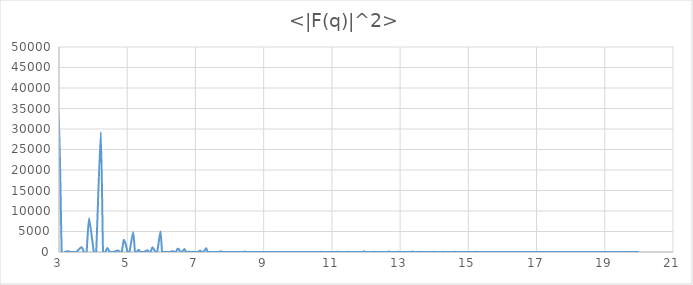
| Category | <|F(q)|^2> |
|---|---|
| 0.0 | 287296.001 |
| 0.746842 | 0 |
| 1.056195 | 0 |
| 1.293569 | 7127.229 |
| 1.493685 | 0.997 |
| 1.66999 | 0 |
| 1.829383 | 0 |
| 2.112389 | 4289.775 |
| 2.240527 | 0 |
| 2.361723 | 0 |
| 2.476996 | 12698.126 |
| 2.587138 | 2357.81 |
| 2.692779 | 0 |
| 2.794428 | 0 |
| 2.98737 | 35082.252 |
| 3.07931 | 0 |
| 3.168584 | 0 |
| 3.255411 | 201.297 |
| 3.339981 | 1.784 |
| 3.422462 | 0 |
| 3.503001 | 0 |
| 3.658766 | 1182.676 |
| 3.734212 | 0 |
| 3.808164 | 0 |
| 3.880707 | 8228.632 |
| 4.021869 | 0 |
| 4.090624 | 0 |
| 4.224779 | 29259.504 |
| 4.290283 | 0 |
| 4.354802 | 0 |
| 4.418379 | 999.587 |
| 4.481054 | 59.221 |
| 4.542865 | 0 |
| 4.603846 | 0 |
| 4.723446 | 388.815 |
| 4.782125 | 0 |
| 4.840092 | 0 |
| 4.897373 | 2905.064 |
| 4.953992 | 1963.209 |
| 5.009971 | 0 |
| 5.065332 | 0 |
| 5.174276 | 4849.136 |
| 5.227897 | 0 |
| 5.280973 | 0 |
| 5.333522 | 540.499 |
| 5.385557 | 6.911 |
| 5.437095 | 0 |
| 5.488148 | 0 |
| 5.588857 | 426.93 |
| 5.638537 | 0 |
| 5.687782 | 0 |
| 5.736605 | 1158.048 |
| 5.833026 | 0 |
| 5.880643 | 0 |
| 5.974739 | 5047.953 |
| 6.021236 | 0 |
| 6.067376 | 0 |
| 6.113169 | 10.966 |
| 6.15862 | 6.677 |
| 6.203739 | 0 |
| 6.248532 | 0 |
| 6.337168 | 218.027 |
| 6.381024 | 0 |
| 6.424581 | 0 |
| 6.467845 | 690.596 |
| 6.510821 | 722.292 |
| 6.553516 | 0 |
| 6.595934 | 0 |
| 6.679962 | 741.55 |
| 6.721582 | 0 |
| 6.762946 | 0 |
| 6.804058 | 71.332 |
| 6.844924 | 11.957 |
| 6.885547 | 0 |
| 6.925932 | 0 |
| 7.006003 | 26.612 |
| 7.045697 | 0 |
| 7.085169 | 0 |
| 7.124423 | 335.788 |
| 7.202287 | 0 |
| 7.240906 | 0 |
| 7.317531 | 959.275 |
| 7.355545 | 0 |
| 7.393363 | 0 |
| 7.430988 | 24.122 |
| 7.468424 | 1.107 |
| 7.505673 | 0 |
| 7.542739 | 0 |
| 7.616328 | 30.217 |
| 7.652857 | 0 |
| 7.689213 | 0 |
| 7.725398 | 134.426 |
| 7.761414 | 100.033 |
| 7.797264 | 0 |
| 7.832949 | 0 |
| 7.939044 | 0 |
| 7.974095 | 0 |
| 8.008993 | 16.462 |
| 8.043739 | 0.978 |
| 8.078336 | 0 |
| 8.112785 | 0 |
| 8.181249 | 7.086 |
| 8.215267 | 0 |
| 8.249144 | 0 |
| 8.282883 | 25.98 |
| 8.349952 | 0 |
| 8.383285 | 0 |
| 8.449557 | 99.817 |
| 8.482499 | 0 |
| 8.515314 | 0 |
| 8.548002 | 3.303 |
| 8.580566 | 0.495 |
| 8.613007 | 0 |
| 8.645326 | 0 |
| 8.709604 | 1.879 |
| 8.741566 | 0 |
| 8.773412 | 0 |
| 8.805142 | 6.072 |
| 8.836759 | 5.076 |
| 8.868262 | 0 |
| 8.899654 | 0 |
| 8.962109 | 8.65 |
| 8.993174 | 0 |
| 9.024131 | 0 |
| 9.054983 | 0.429 |
| 9.08573 | 0.003 |
| 9.116373 | 0 |
| 9.146914 | 0 |
| 9.207692 | 0.102 |
| 9.23793 | 0 |
| 9.268071 | 0 |
| 9.298113 | 0.193 |
| 9.357909 | 0 |
| 9.387664 | 0 |
| 9.446892 | 13.176 |
| 9.476368 | 0 |
| 9.505752 | 0 |
| 9.535046 | 0.169 |
| 9.56425 | 0.022 |
| 9.593365 | 0 |
| 9.622391 | 0 |
| 9.680184 | 0.681 |
| 9.708951 | 0 |
| 9.737634 | 0 |
| 9.766232 | 6.063 |
| 9.794746 | 1.783 |
| 9.823178 | 0 |
| 9.851528 | 0 |
| 9.907984 | 13.92 |
| 9.936092 | 0 |
| 9.964121 | 0 |
| 9.99207 | 4.409 |
| 10.019942 | 0.096 |
| 10.047737 | 0 |
| 10.075455 | 0 |
| 10.130663 | 2.152 |
| 10.158155 | 0 |
| 10.185573 | 0 |
| 10.212916 | 19.161 |
| 10.267386 | 0 |
| 10.294512 | 0 |
| 10.348552 | 25.741 |
| 10.375466 | 0 |
| 10.402311 | 0 |
| 10.429087 | 5.575 |
| 10.455794 | 0.449 |
| 10.482433 | 0 |
| 10.509004 | 0 |
| 10.561947 | 3.25 |
| 10.588319 | 0 |
| 10.614625 | 0 |
| 10.640866 | 22.802 |
| 10.667043 | 55.324 |
| 10.693156 | 0 |
| 10.719205 | 0 |
| 10.771114 | 19.37 |
| 10.796976 | 0 |
| 10.822775 | 0 |
| 10.848513 | 0.894 |
| 10.87419 | 1.37 |
| 10.899806 | 0 |
| 10.925363 | 0 |
| 10.976297 | 4.587 |
| 11.001676 | 0 |
| 11.026996 | 0 |
| 11.052258 | 29.786 |
| 11.102611 | 0 |
| 11.127701 | 0 |
| 11.177714 | 81.285 |
| 11.202636 | 0 |
| 11.227503 | 0 |
| 11.252316 | 4.654 |
| 11.277073 | 0.984 |
| 11.301777 | 0 |
| 11.326426 | 0 |
| 11.375565 | 13.295 |
| 11.400055 | 0 |
| 11.424492 | 0 |
| 11.448877 | 36.912 |
| 11.473211 | 57.323 |
| 11.497493 | 0 |
| 11.521724 | 0 |
| 11.594112 | 0 |
| 11.618141 | 0 |
| 11.642121 | 3.925 |
| 11.666051 | 1.177 |
| 11.689933 | 0 |
| 11.713766 | 0 |
| 11.761286 | 4.782 |
| 11.784975 | 0 |
| 11.808615 | 0 |
| 11.832209 | 31.227 |
| 11.879256 | 0 |
| 11.902709 | 0 |
| 11.949479 | 181.607 |
| 11.972795 | 0 |
| 11.996065 | 0 |
| 12.019291 | 4.482 |
| 12.042472 | 0.741 |
| 12.065608 | 0 |
| 12.088701 | 0 |
| 12.134753 | 9.42 |
| 12.157714 | 0 |
| 12.180631 | 0 |
| 12.203506 | 31.783 |
| 12.226337 | 56.857 |
| 12.249126 | 0 |
| 12.271873 | 0 |
| 12.317241 | 33.372 |
| 12.339862 | 0 |
| 12.362442 | 0 |
| 12.38498 | 4.846 |
| 12.407478 | 0.904 |
| 12.429935 | 0 |
| 12.452352 | 0 |
| 12.497064 | 10.83 |
| 12.51936 | 0 |
| 12.541617 | 0 |
| 12.563834 | 25.943 |
| 12.608151 | 0 |
| 12.630251 | 0 |
| 12.674336 | 126.874 |
| 12.696321 | 0 |
| 12.718268 | 0 |
| 12.740177 | 7.005 |
| 12.762049 | 1.714 |
| 12.783883 | 0 |
| 12.80568 | 0 |
| 12.849163 | 9.377 |
| 12.870849 | 0 |
| 12.892499 | 0 |
| 12.914113 | 38.525 |
| 12.93569 | 46.37 |
| 12.957232 | 0 |
| 12.978737 | 0 |
| 13.021642 | 13.272 |
| 13.043042 | 0 |
| 13.064407 | 0 |
| 13.085736 | 6.803 |
| 13.107031 | 0.776 |
| 13.128292 | 0 |
| 13.149518 | 0 |
| 13.191867 | 20.081 |
| 13.212991 | 0 |
| 13.234081 | 0 |
| 13.255138 | 35.133 |
| 13.297151 | 0 |
| 13.318108 | 0 |
| 13.359923 | 110.589 |
| 13.380782 | 0 |
| 13.401608 | 0 |
| 13.422402 | 6.084 |
| 13.443163 | 1.613 |
| 13.463893 | 0 |
| 13.484591 | 0 |
| 13.525891 | 8.015 |
| 13.546494 | 0 |
| 13.567066 | 0 |
| 13.587607 | 23.995 |
| 13.608116 | 60.746 |
| 13.628595 | 0 |
| 13.649043 | 0 |
| 13.689848 | 19.576 |
| 13.710204 | 0 |
| 13.730531 | 0 |
| 13.750827 | 5.98 |
| 13.771094 | 2.074 |
| 13.79133 | 0 |
| 13.811538 | 0 |
| 13.851863 | 6.132 |
| 13.871982 | 0 |
| 13.892072 | 0 |
| 13.912133 | 32.184 |
| 13.952168 | 0 |
| 13.972142 | 0 |
| 14.012006 | 60.528 |
| 14.031895 | 0 |
| 14.051756 | 0 |
| 14.071589 | 1.226 |
| 14.091394 | 1.216 |
| 14.111172 | 0 |
| 14.130922 | 0 |
| 14.170338 | 4.115 |
| 14.190006 | 0 |
| 14.209646 | 0 |
| 14.229259 | 28.622 |
| 14.248845 | 72.874 |
| 14.268404 | 0 |
| 14.287937 | 0 |
| 14.346374 | 0 |
| 14.365801 | 0 |
| 14.385201 | 3.221 |
| 14.404575 | 0.691 |
| 14.423923 | 0 |
| 14.443245 | 0 |
| 14.481812 | 7.782 |
| 14.501057 | 0 |
| 14.520276 | 0 |
| 14.53947 | 26.984 |
| 14.577782 | 0 |
| 14.596901 | 0 |
| 14.635063 | 59.019 |
| 14.654106 | 0 |
| 14.673125 | 0 |
| 14.69212 | 2.074 |
| 14.711089 | 1.222 |
| 14.730035 | 0 |
| 14.748956 | 0 |
| 14.786725 | 7.46 |
| 14.805574 | 0 |
| 14.824399 | 0 |
| 14.843199 | 19.168 |
| 14.861976 | 29.519 |
| 14.88073 | 0 |
| 14.899459 | 0 |
| 14.936848 | 13.718 |
| 14.955508 | 0 |
| 14.974144 | 0 |
| 14.992757 | 0.747 |
| 15.011347 | 1.069 |
| 15.029914 | 0 |
| 15.048458 | 0 |
| 15.085477 | 3.344 |
| 15.103953 | 0 |
| 15.122406 | 0 |
| 15.140837 | 19.558 |
| 15.177631 | 0 |
| 15.195995 | 0 |
| 15.232656 | 57.544 |
| 15.250954 | 0 |
| 15.269229 | 0 |
| 15.287483 | 1.648 |
| 15.305715 | 0.369 |
| 15.323925 | 0 |
| 15.342114 | 0 |
| 15.378427 | 5.178 |
| 15.396551 | 0 |
| 15.414654 | 0 |
| 15.432735 | 14.309 |
| 15.450796 | 25.792 |
| 15.468835 | 0 |
| 15.486854 | 0 |
| 15.522828 | 14.26 |
| 15.540784 | 0 |
| 15.558719 | 0 |
| 15.576634 | 1.452 |
| 15.594527 | 0.802 |
| 15.612401 | 0 |
| 15.630254 | 0 |
| 15.665899 | 3.663 |
| 15.683691 | 0 |
| 15.701463 | 0 |
| 15.719214 | 15.421 |
| 15.754658 | 0 |
| 15.77235 | 0 |
| 15.825307 | 0 |
| 15.84292 | 0 |
| 15.860514 | 3.698 |
| 15.878088 | 0.526 |
| 15.895642 | 0 |
| 15.913177 | 0 |
| 15.94819 | 4.813 |
| 15.965667 | 0 |
| 15.983126 | 0 |
| 16.000565 | 13.528 |
| 16.017985 | 18.871 |
| 16.035387 | 0 |
| 16.052769 | 0 |
| 16.087478 | 4.991 |
| 16.104804 | 0 |
| 16.122112 | 0 |
| 16.139401 | 1.838 |
| 16.156672 | 0.523 |
| 16.173924 | 0 |
| 16.191158 | 0 |
| 16.22557 | 3.241 |
| 16.242749 | 0 |
| 16.25991 | 0 |
| 16.277053 | 11.411 |
| 16.311285 | 0 |
| 16.328373 | 0 |
| 16.362497 | 36.234 |
| 16.379533 | 0 |
| 16.396551 | 0 |
| 16.413551 | 1.303 |
| 16.430533 | 0.625 |
| 16.447498 | 0 |
| 16.464445 | 0 |
| 16.498288 | 3.578 |
| 16.515183 | 0 |
| 16.532062 | 0 |
| 16.548922 | 10.951 |
| 16.565766 | 26.908 |
| 16.582593 | 0 |
| 16.599402 | 0 |
| 16.649729 | 0 |
| 16.666471 | 0 |
| 16.683196 | 3.148 |
| 16.699904 | 0.604 |
| 16.716596 | 0 |
| 16.733271 | 0 |
| 16.766571 | 2.757 |
| 16.783196 | 0 |
| 16.799805 | 0 |
| 16.816397 | 6.857 |
| 16.849533 | 0 |
| 16.866076 | 0 |
| 16.899115 | 20.087 |
| 16.91561 | 0 |
| 16.932089 | 0 |
| 16.948552 | 0.854 |
| 16.964998 | 0.582 |
| 16.981429 | 0 |
| 16.997845 | 0 |
| 17.030627 | 1.624 |
| 17.046995 | 0 |
| 17.063347 | 0 |
| 17.079683 | 7.084 |
| 17.096004 | 16.465 |
| 17.112309 | 0 |
| 17.128599 | 0 |
| 17.161132 | 2.268 |
| 17.177376 | 0 |
| 17.193604 | 0 |
| 17.209816 | 0.687 |
| 17.226014 | 0.363 |
| 17.242196 | 0 |
| 17.258363 | 0 |
| 17.290652 | 2.147 |
| 17.306774 | 0 |
| 17.322881 | 0 |
| 17.338972 | 6.68 |
| 17.371111 | 0 |
| 17.387159 | 0 |
| 17.419209 | 13.302 |
| 17.435212 | 0 |
| 17.4512 | 0 |
| 17.467174 | 1.932 |
| 17.483133 | 0.651 |
| 17.499077 | 0 |
| 17.515007 | 0 |
| 17.546824 | 1.437 |
| 17.56271 | 0 |
| 17.578583 | 0 |
| 17.594441 | 4.198 |
| 17.610284 | 8.95 |
| 17.626114 | 0 |
| 17.641929 | 0 |
| 17.673517 | 2.02 |
| 17.68929 | 0 |
| 17.705049 | 0 |
| 17.720794 | 0.777 |
| 17.736525 | 0.493 |
| 17.752242 | 0 |
| 17.767945 | 0 |
| 17.799309 | 0.797 |
| 17.81497 | 0 |
| 17.830618 | 0 |
| 17.846252 | 4.771 |
| 17.877479 | 0 |
| 17.893072 | 0 |
| 17.924218 | 10.346 |
| 17.93977 | 0 |
| 17.955309 | 0 |
| 17.970835 | 0.618 |
| 17.986347 | 0.218 |
| 18.001846 | 0 |
| 18.017331 | 0 |
| 18.048262 | 0.891 |
| 18.063708 | 0 |
| 18.079141 | 0 |
| 18.09456 | 4.469 |
| 18.109966 | 9.207 |
| 18.125359 | 0 |
| 18.140739 | 0 |
| 18.17146 | 6.733 |
| 18.186801 | 0 |
| 18.202129 | 0 |
| 18.217445 | 0.17 |
| 18.232747 | 0.099 |
| 18.248036 | 0 |
| 18.263313 | 0 |
| 18.293828 | 1.478 |
| 18.309067 | 0 |
| 18.324293 | 0 |
| 18.339506 | 3.355 |
| 18.369894 | 0 |
| 18.38507 | 0 |
| 18.415383 | 8.943 |
| 18.430521 | 0 |
| 18.445647 | 0 |
| 18.46076 | 0.374 |
| 18.475861 | 0.192 |
| 18.490949 | 0 |
| 18.506026 | 0 |
| 18.536141 | 0.973 |
| 18.551181 | 0 |
| 18.566208 | 0 |
| 18.581223 | 2.191 |
| 18.596226 | 3.559 |
| 18.611217 | 0 |
| 18.626196 | 0 |
| 18.67106 | 0 |
| 18.685991 | 0 |
| 18.70091 | 0.982 |
| 18.715817 | 0.155 |
| 18.730712 | 0 |
| 18.745596 | 0 |
| 18.775327 | 0.864 |
| 18.790175 | 0 |
| 18.805011 | 0 |
| 18.819836 | 2.487 |
| 18.84945 | 0 |
| 18.86424 | 0 |
| 18.893785 | 9.152 |
| 18.90854 | 0 |
| 18.923283 | 0 |
| 18.938015 | 0.917 |
| 18.952736 | 0.136 |
| 18.967445 | 0 |
| 18.982143 | 0 |
| 19.011504 | 0.472 |
| 19.026168 | 0 |
| 19.04082 | 0 |
| 19.055461 | 2.385 |
| 19.070091 | 1.243 |
| 19.08471 | 0 |
| 19.099317 | 0 |
| 19.128499 | 1.249 |
| 19.143073 | 0 |
| 19.157636 | 0 |
| 19.172188 | 0.446 |
| 19.186729 | 0.185 |
| 19.201259 | 0 |
| 19.215778 | 0 |
| 19.244783 | 0.439 |
| 19.259269 | 0 |
| 19.273744 | 0 |
| 19.288208 | 1.576 |
| 19.317105 | 0 |
| 19.331537 | 0 |
| 19.360368 | 3.059 |
| 19.374768 | 0 |
| 19.389157 | 0 |
| 19.403535 | 0.623 |
| 19.417903 | 0.138 |
| 19.43226 | 0 |
| 19.446606 | 0 |
| 19.475267 | 0.446 |
| 19.489582 | 0 |
| 19.503887 | 0 |
| 19.51818 | 1.864 |
| 19.532464 | 3.756 |
| 19.546737 | 0 |
| 19.560999 | 0 |
| 19.589493 | 0.003 |
| 19.603724 | 0 |
| 19.617945 | 0 |
| 19.632156 | 0.062 |
| 19.646357 | 0.244 |
| 19.660547 | 0 |
| 19.674727 | 0 |
| 19.703056 | 0.059 |
| 19.717206 | 0 |
| 19.731345 | 0 |
| 19.745474 | 0.901 |
| 19.773702 | 0 |
| 19.787801 | 0 |
| 19.815969 | 3.172 |
| 19.830037 | 0 |
| 19.844096 | 0 |
| 19.858145 | 0.232 |
| 19.872184 | 0.289 |
| 19.886213 | 0 |
| 19.900232 | 0 |
| 19.928241 | 0.489 |
| 19.942231 | 0 |
| 19.956211 | 0 |
| 19.970181 | 1.092 |
| 19.984141 | 3.416 |
| 19.998092 | 0 |